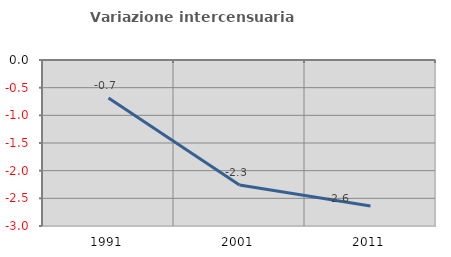
| Category | Variazione intercensuaria annua |
|---|---|
| 1991.0 | -0.687 |
| 2001.0 | -2.258 |
| 2011.0 | -2.638 |